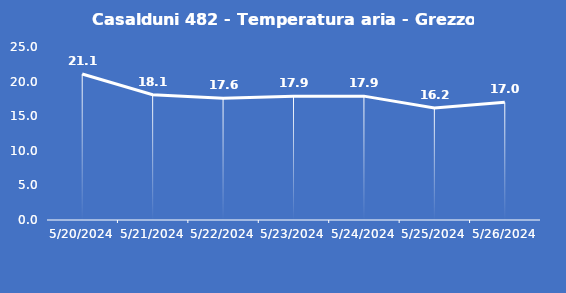
| Category | Casalduni 482 - Temperatura aria - Grezzo (°C) |
|---|---|
| 5/20/24 | 21.1 |
| 5/21/24 | 18.1 |
| 5/22/24 | 17.6 |
| 5/23/24 | 17.9 |
| 5/24/24 | 17.9 |
| 5/25/24 | 16.2 |
| 5/26/24 | 17 |